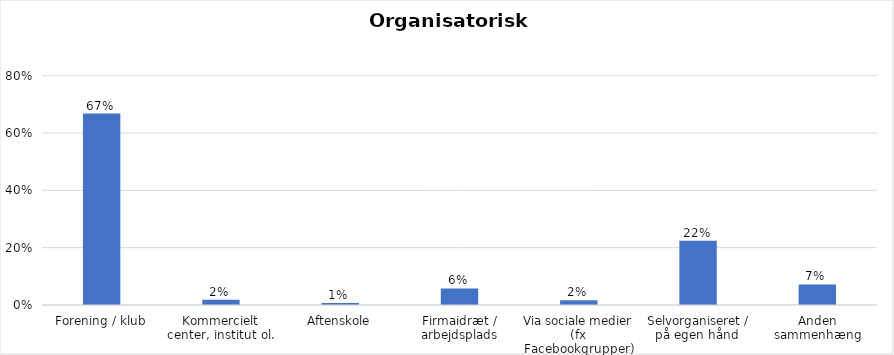
| Category | % |
|---|---|
| Forening / klub | 0.668 |
| Kommercielt center, institut ol. | 0.018 |
| Aftenskole | 0.007 |
| Firmaidræt / arbejdsplads | 0.058 |
| Via sociale medier (fx Facebookgrupper) | 0.017 |
| Selvorganiseret / på egen hånd  | 0.224 |
| Anden sammenhæng | 0.072 |